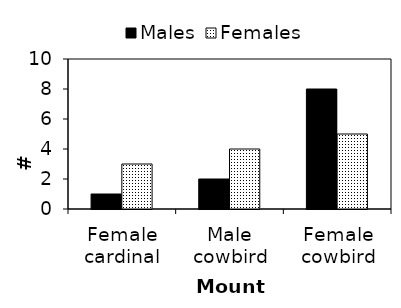
| Category | Males | Females |
|---|---|---|
| Female cardinal | 1 | 3 |
| Male cowbird | 2 | 4 |
| Female cowbird | 8 | 5 |